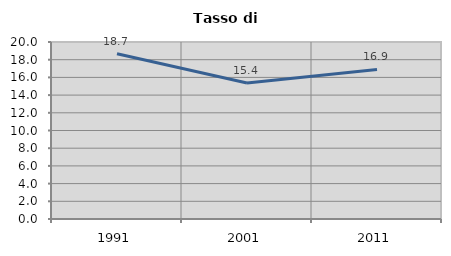
| Category | Tasso di disoccupazione   |
|---|---|
| 1991.0 | 18.673 |
| 2001.0 | 15.372 |
| 2011.0 | 16.901 |